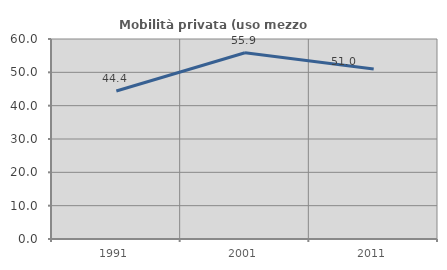
| Category | Mobilità privata (uso mezzo privato) |
|---|---|
| 1991.0 | 44.4 |
| 2001.0 | 55.865 |
| 2011.0 | 51.021 |